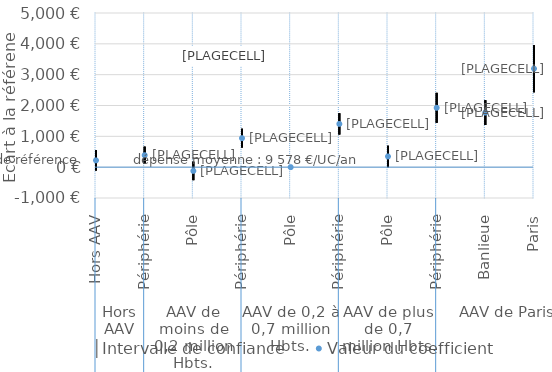
| Category | │Intervalle de confiance | Series 1 | Valeur du coefficient |
|---|---|---|---|
| 0 | 552 | -112 | 220 |
| 1 | 666 | 109 | 388 |
| 2 | 179 | -422 | -121 |
| 3 | 1246 | 634 | 940 |
| 4 | 0 | 0 | 0 |
| 5 | 1749 | 1058 | 1403 |
| 6 | 695 | -3 | 346 |
| 7 | 2411 | 1439 | 1925 |
| 8 | 2172 | 1368 | 1770 |
| 9 | 3958 | 2433 | 3196 |